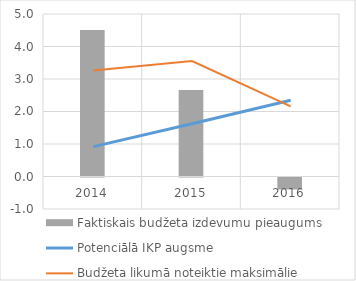
| Category | Faktiskais budžeta izdevumu pieaugums |
|---|---|
| 0 | 4.504 |
| 1 | 2.661 |
| 2 | -0.369 |